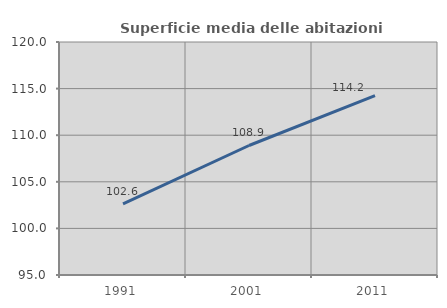
| Category | Superficie media delle abitazioni occupate |
|---|---|
| 1991.0 | 102.628 |
| 2001.0 | 108.895 |
| 2011.0 | 114.243 |